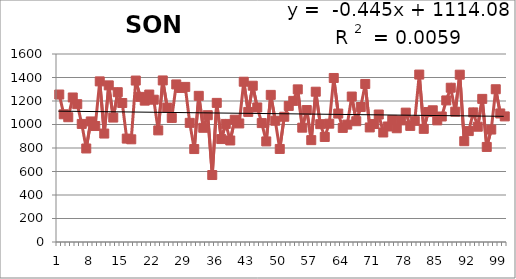
| Category | 1913-2012 |
|---|---|
| 0 | 1255 |
| 1 | 1087 |
| 2 | 1062 |
| 3 | 1230 |
| 4 | 1173 |
| 5 | 1005 |
| 6 | 796 |
| 7 | 1026 |
| 8 | 987 |
| 9 | 1367 |
| 10 | 923 |
| 11 | 1333 |
| 12 | 1059 |
| 13 | 1275 |
| 14 | 1183 |
| 15 | 880 |
| 16 | 874 |
| 17 | 1374 |
| 18 | 1235 |
| 19 | 1203 |
| 20 | 1255 |
| 21 | 1211 |
| 22 | 950 |
| 23 | 1375 |
| 24 | 1144 |
| 25 | 1056 |
| 26 | 1341 |
| 27 | 1311 |
| 28 | 1320 |
| 29 | 1014 |
| 30 | 791 |
| 31 | 1244 |
| 32 | 972 |
| 33 | 1079 |
| 34 | 570 |
| 35 | 1184 |
| 36 | 876 |
| 37 | 1005 |
| 38 | 864 |
| 39 | 1041 |
| 40 | 1009 |
| 41 | 1364 |
| 42 | 1107 |
| 43 | 1330 |
| 44 | 1145 |
| 45 | 1012 |
| 46 | 856 |
| 47 | 1252 |
| 48 | 1032 |
| 49 | 792 |
| 50 | 1066 |
| 51 | 1158 |
| 52 | 1201 |
| 53 | 1299 |
| 54 | 973 |
| 55 | 1123 |
| 56 | 867 |
| 57 | 1279 |
| 58 | 1003 |
| 59 | 894 |
| 60 | 1007 |
| 61 | 1396 |
| 62 | 1093 |
| 63 | 971 |
| 64 | 999 |
| 65 | 1238 |
| 66 | 1028 |
| 67 | 1149 |
| 68 | 1345 |
| 69 | 975 |
| 70 | 1004 |
| 71 | 1085 |
| 72 | 932 |
| 73 | 983 |
| 74 | 1039 |
| 75 | 968 |
| 76 | 1035 |
| 77 | 1101 |
| 78 | 988 |
| 79 | 1031 |
| 80 | 1425 |
| 81 | 963 |
| 82 | 1106 |
| 83 | 1121 |
| 84 | 1035 |
| 85 | 1068 |
| 86 | 1205 |
| 87 | 1313 |
| 88 | 1109 |
| 89 | 1424 |
| 90 | 858 |
| 91 | 944 |
| 92 | 1103 |
| 93 | 981 |
| 94 | 1218 |
| 95 | 809 |
| 96 | 957 |
| 97 | 1300 |
| 98 | 1094 |
| 99 | 1069 |